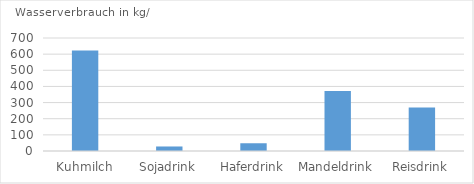
| Category | Wasserverbrauch in kg/L |
|---|---|
| Kuhmilch | 623 |
| Sojadrink | 28 |
| Haferdrink | 48 |
| Mandeldrink | 371 |
| Reisdrink | 270 |